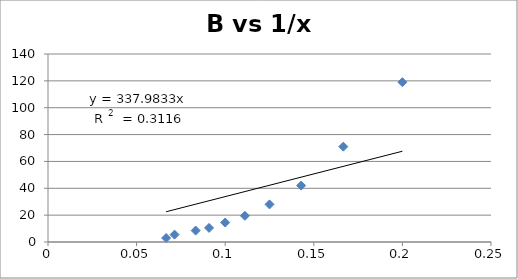
| Category | B |
|---|---|
| 0.2 | 119 |
| 0.16666666666666666 | 71 |
| 0.14285714285714285 | 42 |
| 0.125 | 28 |
| 0.1111111111111111 | 19.5 |
| 0.1 | 14.5 |
| 0.09090909090909091 | 10.5 |
| 0.08333333333333333 | 8.5 |
| 0.07142857142857142 | 5.5 |
| 0.06666666666666667 | 3 |